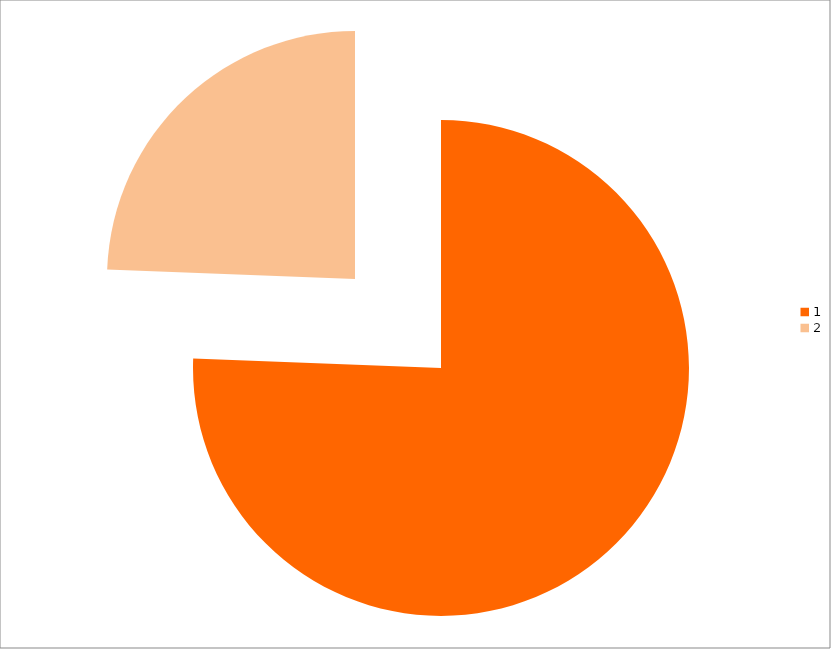
| Category | Series 0 |
|---|---|
| 0 | 313 |
| 1 | 101 |